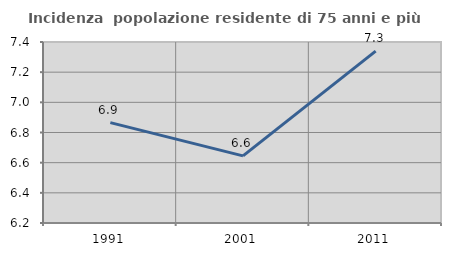
| Category | Incidenza  popolazione residente di 75 anni e più |
|---|---|
| 1991.0 | 6.865 |
| 2001.0 | 6.645 |
| 2011.0 | 7.339 |